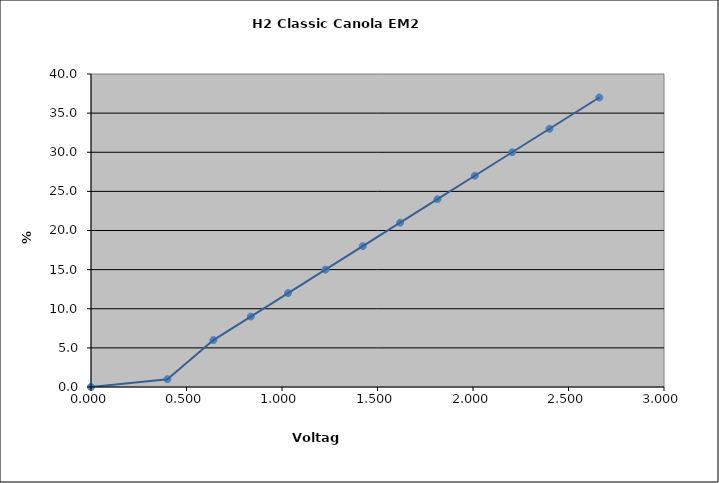
| Category | Generated Curve |
|---|---|
| 0.0 | 0 |
| 0.4 | 1 |
| 0.6409999999999999 | 6 |
| 0.8364999999999999 | 9 |
| 1.032 | 12 |
| 1.2274999999999998 | 15 |
| 1.4229999999999998 | 18 |
| 1.6184999999999998 | 21 |
| 1.8139999999999998 | 24 |
| 2.0095 | 27 |
| 2.205 | 30 |
| 2.4005 | 33 |
| 2.6611666666666665 | 37 |